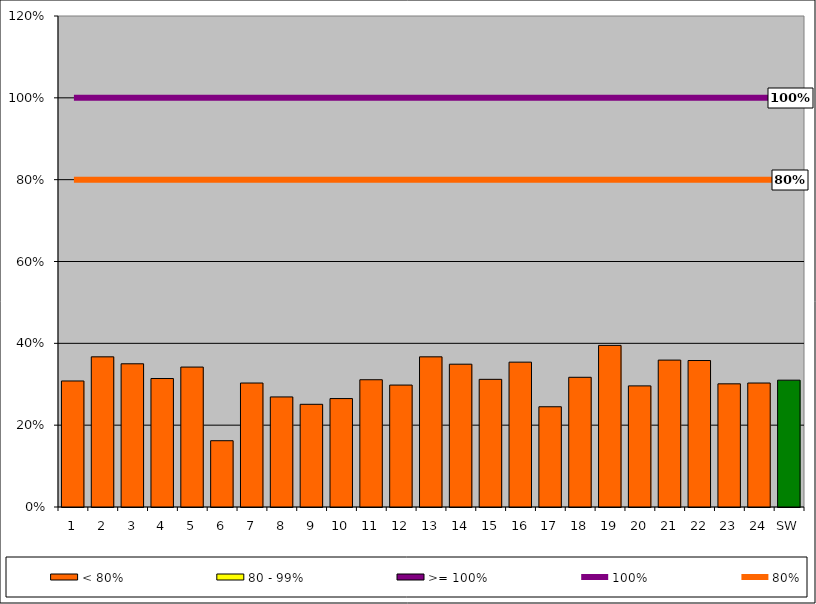
| Category | < 80% | 80 - 99% | >= 100% |
|---|---|---|---|
| 1 | 0.308 | 0 | 0 |
| 2 | 0.367 | 0 | 0 |
| 3 | 0.35 | 0 | 0 |
| 4 | 0.314 | 0 | 0 |
| 5 | 0.342 | 0 | 0 |
| 6 | 0.162 | 0 | 0 |
| 7 | 0.303 | 0 | 0 |
| 8 | 0.269 | 0 | 0 |
| 9 | 0.251 | 0 | 0 |
| 10 | 0.265 | 0 | 0 |
| 11 | 0.311 | 0 | 0 |
| 12 | 0.298 | 0 | 0 |
| 13 | 0.367 | 0 | 0 |
| 14 | 0.349 | 0 | 0 |
| 15 | 0.312 | 0 | 0 |
| 16 | 0.354 | 0 | 0 |
| 17 | 0.245 | 0 | 0 |
| 18 | 0.317 | 0 | 0 |
| 19 | 0.395 | 0 | 0 |
| 20 | 0.296 | 0 | 0 |
| 21 | 0.359 | 0 | 0 |
| 22 | 0.358 | 0 | 0 |
| 23 | 0.301 | 0 | 0 |
| 24 | 0.303 | 0 | 0 |
| SW | 0.31 | 0 | 0 |